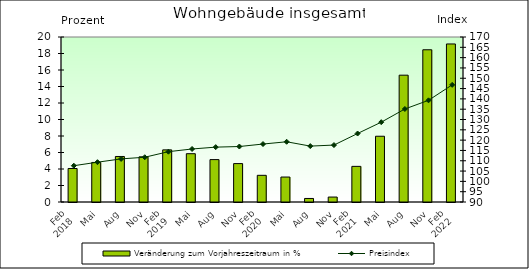
| Category | Veränderung zum Vorjahreszeitraum in % |
|---|---|
| 0 | 4.062 |
| 1 | 4.794 |
| 2 | 5.519 |
| 3 | 5.477 |
| 4 | 6.32 |
| 5 | 5.855 |
| 6 | 5.14 |
| 7 | 4.655 |
| 8 | 3.234 |
| 9 | 3.025 |
| 10 | 0.429 |
| 11 | 0.599 |
| 12 | 4.318 |
| 13 | 7.97 |
| 14 | 15.371 |
| 15 | 18.452 |
| 16 | 19.156 |